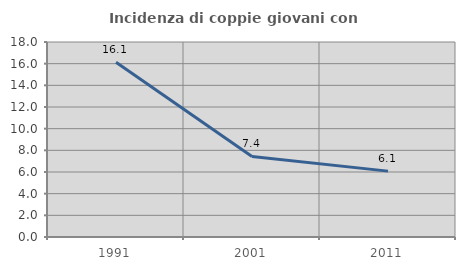
| Category | Incidenza di coppie giovani con figli |
|---|---|
| 1991.0 | 16.138 |
| 2001.0 | 7.433 |
| 2011.0 | 6.081 |